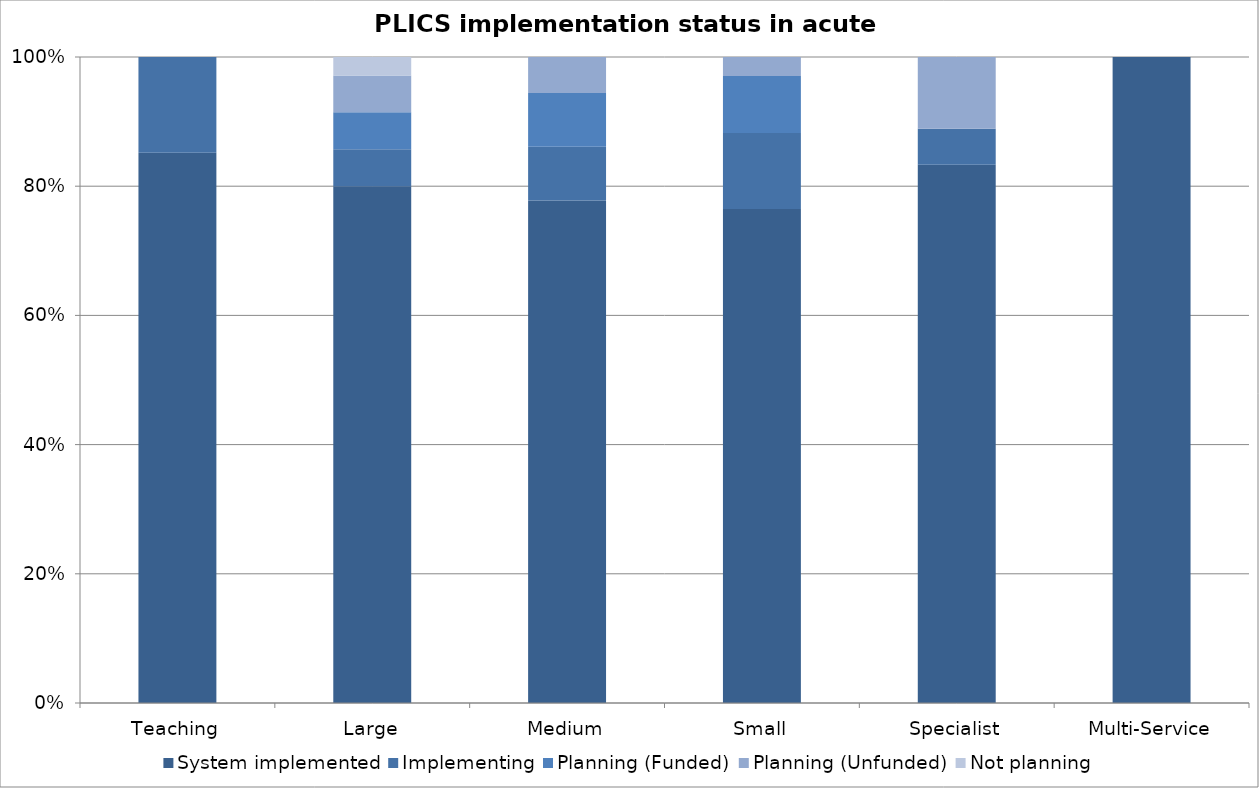
| Category | System implemented | Implementing | Planning (Funded) | Planning (Unfunded) | Not planning |
|---|---|---|---|---|---|
| Teaching | 23 | 4 | 0 | 0 | 0 |
| Large | 28 | 2 | 2 | 2 | 1 |
| Medium | 28 | 3 | 3 | 2 | 0 |
| Small | 26 | 4 | 3 | 1 | 0 |
| Specialist | 15 | 1 | 0 | 2 | 0 |
| Multi-Service | 3 | 0 | 0 | 0 | 0 |